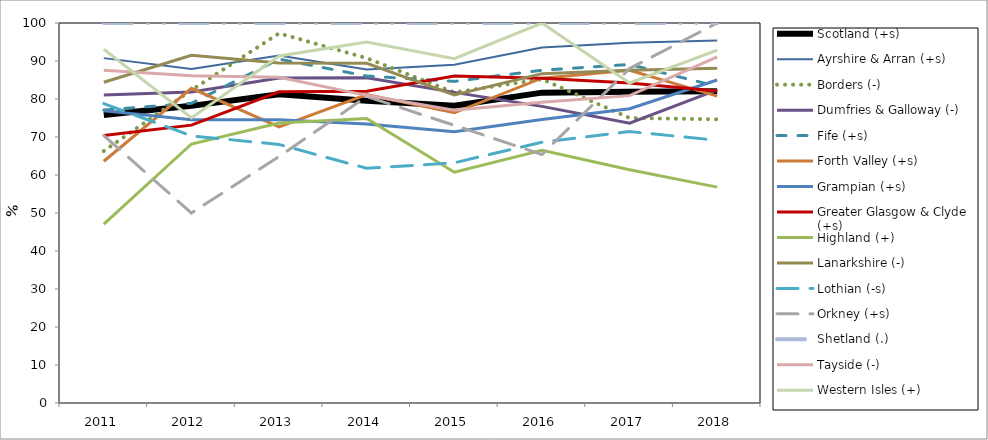
| Category | Scotland (+s) | Ayrshire & Arran (+s) | Borders (-) | Dumfries & Galloway (-) | Fife (+s) | Forth Valley (+s) | Grampian (+s) | Greater Glasgow & Clyde (+s) | Highland (+) | Lanarkshire (-) | Lothian (-s) | Orkney (+s) | Shetland (.) | Tayside (-) | Western Isles (+) |
|---|---|---|---|---|---|---|---|---|---|---|---|---|---|---|---|
| 2011.0 | 75.775 | 90.758 | 66.31 | 81.057 | 77.098 | 63.616 | 76.895 | 70.38 | 47.074 | 84.409 | 78.795 | 70.37 | 100 | 87.546 | 93.103 |
| 2012.0 | 78.196 | 87.922 | 82.32 | 81.818 | 78.864 | 82.816 | 74.539 | 73.121 | 68.158 | 91.518 | 70.302 | 50 | 100 | 86.146 | 75 |
| 2013.0 | 81.274 | 91.457 | 97.283 | 85.547 | 90.497 | 72.682 | 74.567 | 81.914 | 73.684 | 89.5 | 68.036 | 64.865 | 100 | 85.714 | 91.304 |
| 2014.0 | 79.569 | 87.759 | 90.751 | 85.597 | 86.047 | 81.149 | 73.422 | 82.017 | 74.87 | 89.383 | 61.765 | 80.645 | 100 | 80.962 | 95 |
| 2015.0 | 78.225 | 89.029 | 81.726 | 81.743 | 84.631 | 76.375 | 71.365 | 86.051 | 60.743 | 81.094 | 63.208 | 73.077 | 100 | 77.069 | 90.625 |
| 2016.0 | 81.675 | 93.526 | 85.227 | 78.061 | 87.572 | 85.477 | 74.594 | 85.436 | 66.48 | 86.675 | 68.638 | 65.385 | 100 | 79.148 | 100 |
| 2017.0 | 81.885 | 94.774 | 75 | 73.636 | 89.087 | 87.554 | 77.458 | 84.22 | 61.394 | 87.586 | 71.429 | 88 | 100 | 80.887 | 84.211 |
| 2018.0 | 82.072 | 95.415 | 74.648 | 82.381 | 83.333 | 80.769 | 85 | 82.104 | 56.805 | 88.076 | 69.146 | 100 | 100 | 91.111 | 92.857 |